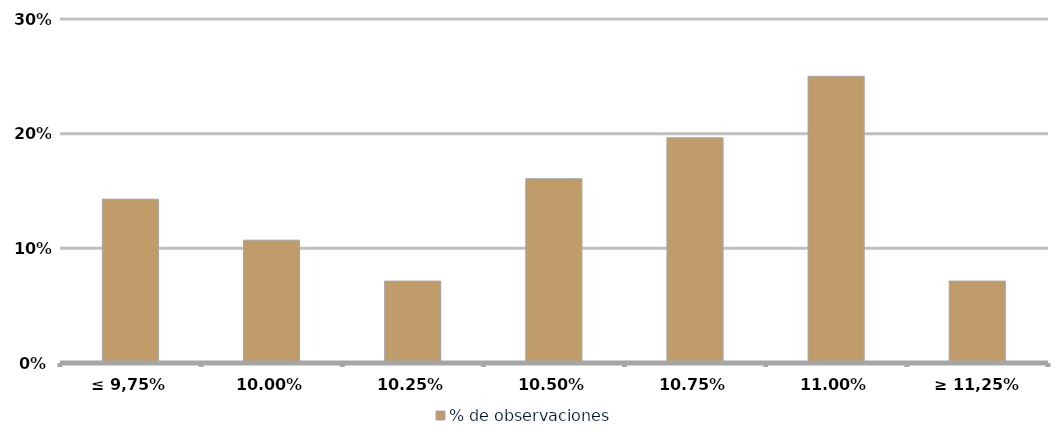
| Category | % de observaciones  |
|---|---|
| ≤ 9,75% | 0.143 |
| 10,00% | 0.107 |
| 10,25% | 0.071 |
| 10,50% | 0.161 |
| 10,75% | 0.196 |
| 11,00% | 0.25 |
| ≥ 11,25% | 0.071 |